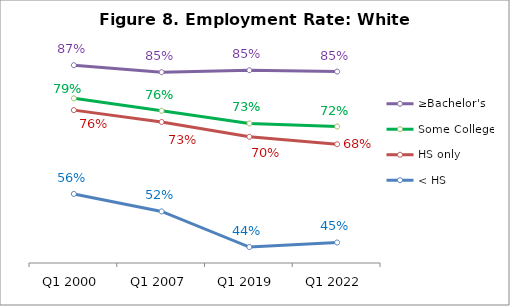
| Category | ≥Bachelor's | Some College | HS only | < HS |
|---|---|---|---|---|
| Q1 2000 | 0.865 | 0.787 | 0.76 | 0.562 |
| Q1 2007 | 0.849 | 0.758 | 0.732 | 0.521 |
| Q1 2019 | 0.854 | 0.728 | 0.697 | 0.438 |
| Q1 2022 | 0.85 | 0.721 | 0.679 | 0.448 |